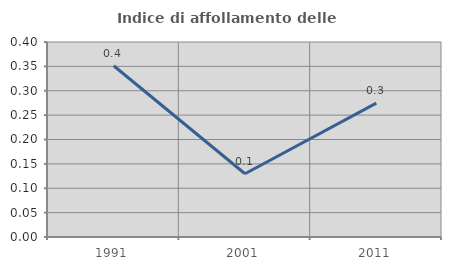
| Category | Indice di affollamento delle abitazioni  |
|---|---|
| 1991.0 | 0.351 |
| 2001.0 | 0.13 |
| 2011.0 | 0.275 |